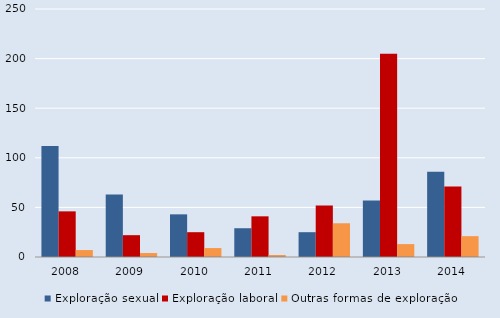
| Category | Exploração sexual | Exploração laboral | Outras formas de exploração  |
|---|---|---|---|
| 2008.0 | 112 | 46 | 7 |
| 2009.0 | 63 | 22 | 4 |
| 2010.0 | 43 | 25 | 9 |
| 2011.0 | 29 | 41 | 2 |
| 2012.0 | 25 | 52 | 34 |
| 2013.0 | 57 | 205 | 13 |
| 2014.0 | 86 | 71 | 21 |